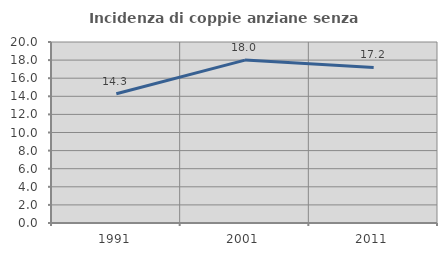
| Category | Incidenza di coppie anziane senza figli  |
|---|---|
| 1991.0 | 14.286 |
| 2001.0 | 18 |
| 2011.0 | 17.188 |